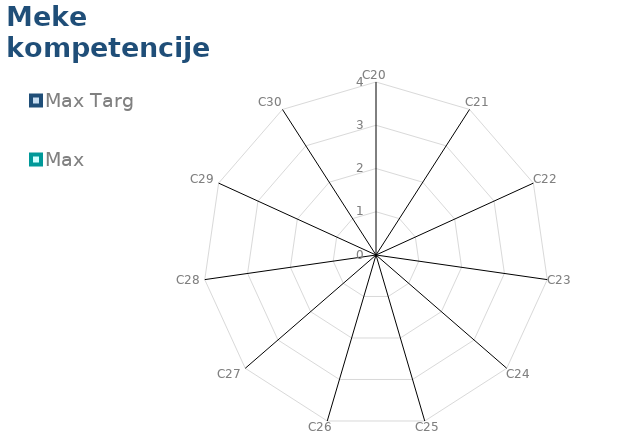
| Category | Max Target | Max |
|---|---|---|
| C20 | 0 | 0 |
| C21 | 0 | 0 |
| C22 | 0 | 0 |
| C23 | 0 | 0 |
| C24 | 0 | 0 |
| C25 | 0 | 0 |
| C26 | 0 | 0 |
| C27 | 0 | 0 |
| C28 | 0 | 0 |
| C29 | 0 | 0 |
| C30 | 0 | 0 |